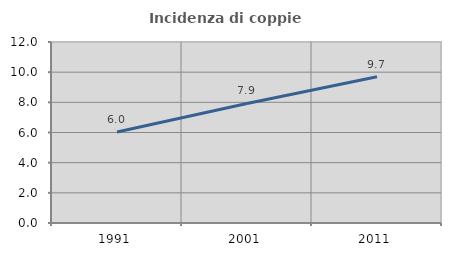
| Category | Incidenza di coppie miste |
|---|---|
| 1991.0 | 6.034 |
| 2001.0 | 7.923 |
| 2011.0 | 9.7 |